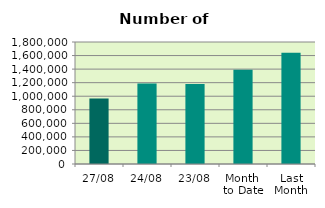
| Category | Series 0 |
|---|---|
| 27/08 | 964938 |
| 24/08 | 1188100 |
| 23/08 | 1178672 |
| Month 
to Date | 1392134.105 |
| Last
Month | 1640369.455 |